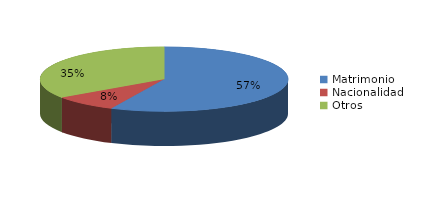
| Category | Series 0 |
|---|---|
| Matrimonio | 1094 |
| Nacionalidad | 162 |
| Otros | 665 |